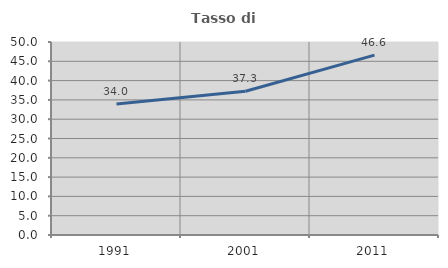
| Category | Tasso di occupazione   |
|---|---|
| 1991.0 | 33.959 |
| 2001.0 | 37.251 |
| 2011.0 | 46.589 |